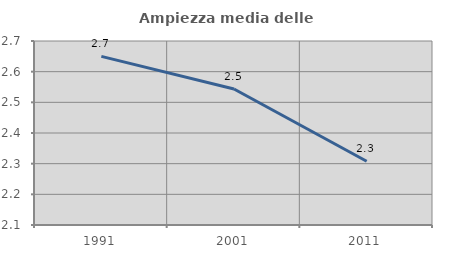
| Category | Ampiezza media delle famiglie |
|---|---|
| 1991.0 | 2.65 |
| 2001.0 | 2.544 |
| 2011.0 | 2.308 |